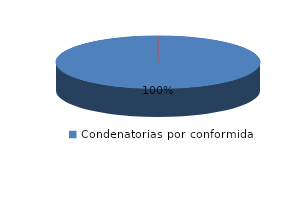
| Category | Series 0 |
|---|---|
| 0 | 3 |
| 1 | 0 |